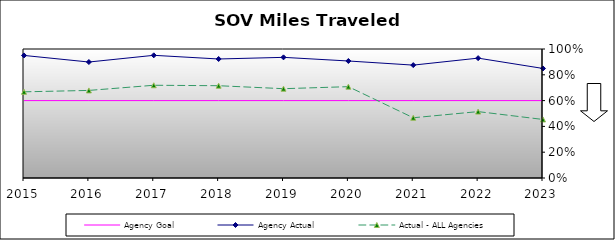
| Category | Agency Goal | Agency Actual | Actual - ALL Agencies |
|---|---|---|---|
| 2015.0 | 0.6 | 0.95 | 0.668 |
| 2016.0 | 0.6 | 0.899 | 0.679 |
| 2017.0 | 0.6 | 0.951 | 0.719 |
| 2018.0 | 0.6 | 0.922 | 0.715 |
| 2019.0 | 0.6 | 0.935 | 0.692 |
| 2020.0 | 0.6 | 0.907 | 0.708 |
| 2021.0 | 0.6 | 0.875 | 0.467 |
| 2022.0 | 0.6 | 0.929 | 0.515 |
| 2023.0 | 0.6 | 0.849 | 0.454 |